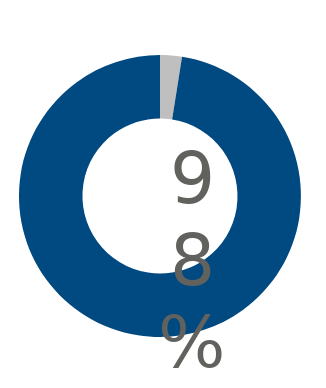
| Category | Series 0 |
|---|---|
| 0 | 0.025 |
| 1 | 0.975 |